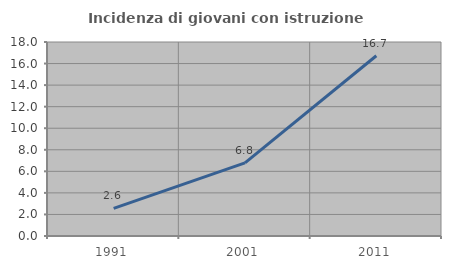
| Category | Incidenza di giovani con istruzione universitaria |
|---|---|
| 1991.0 | 2.564 |
| 2001.0 | 6.79 |
| 2011.0 | 16.727 |